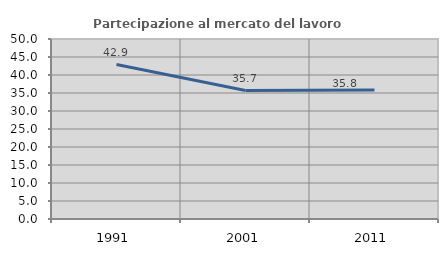
| Category | Partecipazione al mercato del lavoro  femminile |
|---|---|
| 1991.0 | 42.892 |
| 2001.0 | 35.681 |
| 2011.0 | 35.82 |